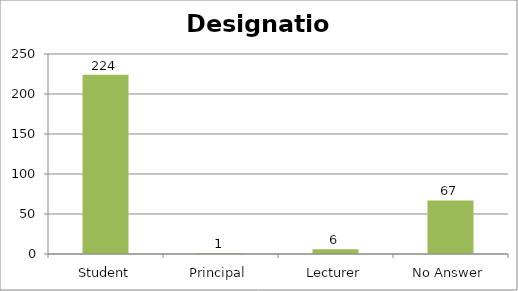
| Category | Designation |
|---|---|
| Student | 224 |
| Principal | 1 |
| Lecturer | 6 |
| No Answer | 67 |